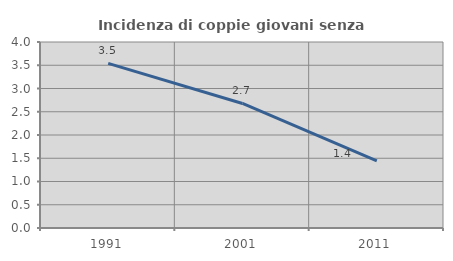
| Category | Incidenza di coppie giovani senza figli |
|---|---|
| 1991.0 | 3.54 |
| 2001.0 | 2.679 |
| 2011.0 | 1.442 |